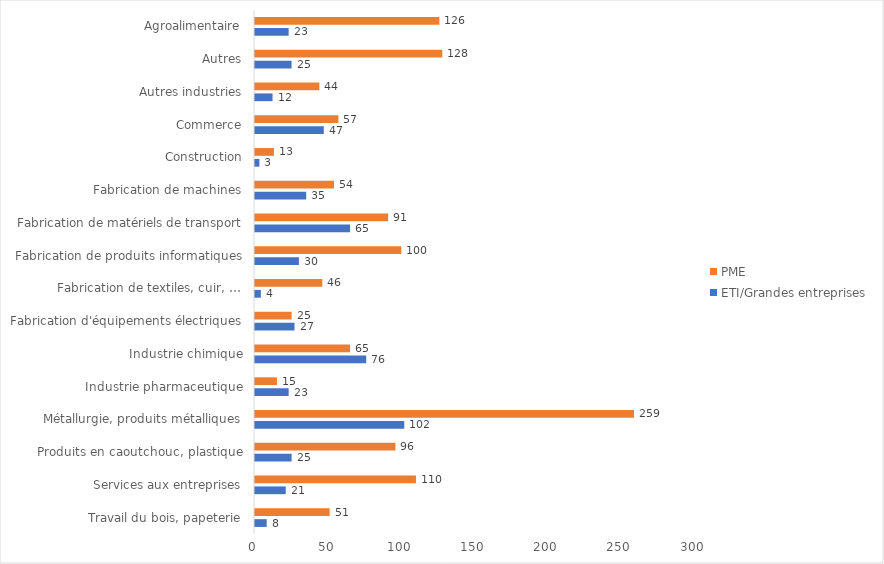
| Category | ETI/Grandes entreprises | PME |
|---|---|---|
| Travail du bois, papeterie | 8 | 51 |
| Services aux entreprises | 21 | 110 |
| Produits en caoutchouc, plastique | 25 | 96 |
| Métallurgie, produits métalliques | 102 | 259 |
| Industrie pharmaceutique | 23 | 15 |
| Industrie chimique | 76 | 65 |
| Fabrication d'équipements électriques | 27 | 25 |
| Fabrication de textiles, cuir, … | 4 | 46 |
| Fabrication de produits informatiques | 30 | 100 |
| Fabrication de matériels de transport | 65 | 91 |
| Fabrication de machines | 35 | 54 |
| Construction | 3 | 13 |
| Commerce | 47 | 57 |
| Autres industries | 12 | 44 |
| Autres | 25 | 128 |
| Agroalimentaire | 23 | 126 |